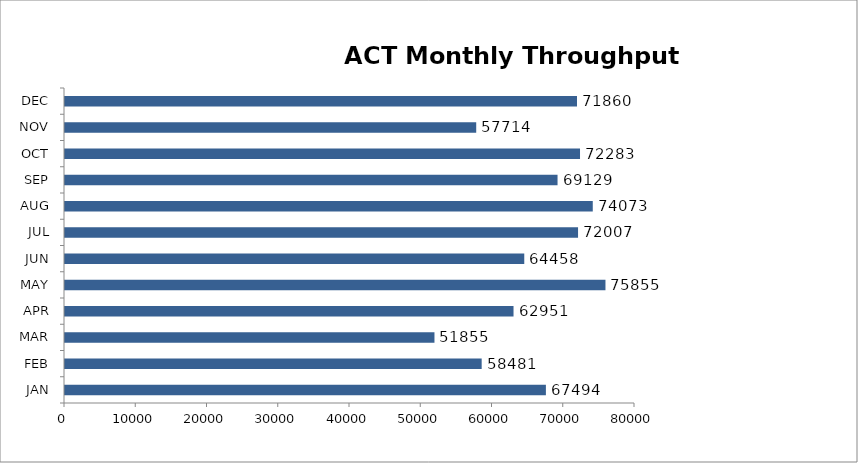
| Category | Monthly Throughput 2019 |
|---|---|
| JAN | 67494 |
| FEB | 58481 |
| MAR | 51855 |
| APR | 62951 |
| MAY | 75855 |
| JUN | 64458 |
| JUL | 72007 |
| AUG | 74073 |
| SEP | 69129 |
| OCT | 72283 |
| NOV | 57714 |
| DEC | 71860 |